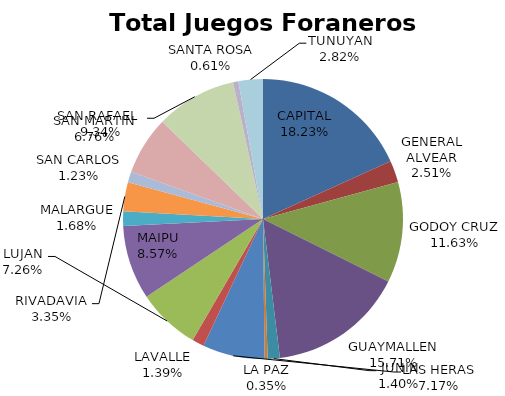
| Category | Total Juegos Foraneros Recaudación  |
|---|---|
| CAPITAL | 5651063 |
| GENERAL ALVEAR | 778112 |
| GODOY CRUZ | 3604139 |
| GUAYMALLEN | 4870201 |
| JUNIN | 432868 |
| LA PAZ | 109706 |
| LAS HERAS | 2223150 |
| LAVALLE | 429485 |
| LUJAN | 2251209 |
| MAIPU | 2657284 |
| MALARGUE | 521756 |
| RIVADAVIA | 1037557 |
| SAN CARLOS | 380870 |
| SAN MARTIN | 2096063 |
| SAN RAFAEL  | 2894595 |
| SANTA ROSA | 189280 |
| TUNUYAN | 875807 |